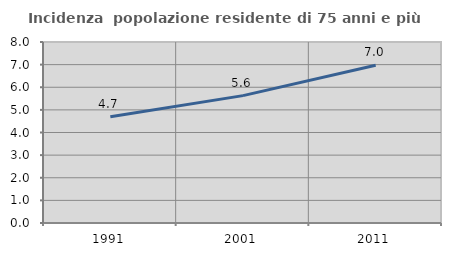
| Category | Incidenza  popolazione residente di 75 anni e più |
|---|---|
| 1991.0 | 4.698 |
| 2001.0 | 5.63 |
| 2011.0 | 6.976 |